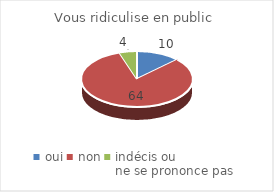
| Category | Vous ridiculise en public |
|---|---|
| oui | 10 |
| non | 64 |
| indécis ou 
ne se prononce pas | 4 |